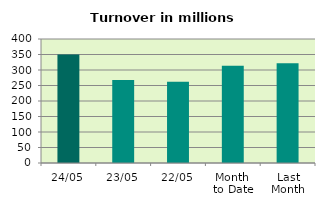
| Category | Series 0 |
|---|---|
| 24/05 | 349.645 |
| 23/05 | 267.349 |
| 22/05 | 262.114 |
| Month 
to Date | 313.446 |
| Last
Month | 322.024 |